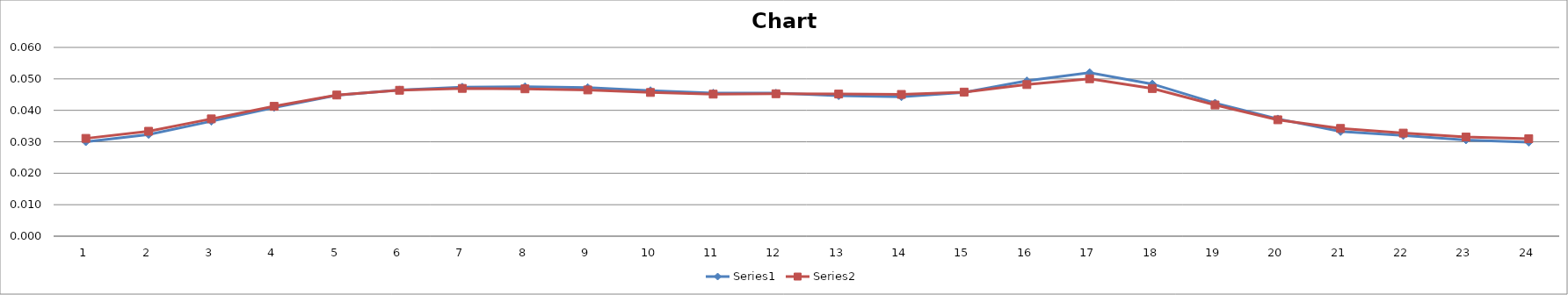
| Category | Series 0 | Series 1 |
|---|---|---|
| 0 | 0.03 | 0.031 |
| 1 | 0.032 | 0.033 |
| 2 | 0.037 | 0.037 |
| 3 | 0.041 | 0.041 |
| 4 | 0.045 | 0.045 |
| 5 | 0.046 | 0.046 |
| 6 | 0.047 | 0.047 |
| 7 | 0.048 | 0.047 |
| 8 | 0.047 | 0.046 |
| 9 | 0.046 | 0.046 |
| 10 | 0.045 | 0.045 |
| 11 | 0.045 | 0.045 |
| 12 | 0.045 | 0.045 |
| 13 | 0.044 | 0.045 |
| 14 | 0.046 | 0.046 |
| 15 | 0.049 | 0.048 |
| 16 | 0.052 | 0.05 |
| 17 | 0.048 | 0.047 |
| 18 | 0.042 | 0.042 |
| 19 | 0.037 | 0.037 |
| 20 | 0.033 | 0.034 |
| 21 | 0.032 | 0.033 |
| 22 | 0.031 | 0.032 |
| 23 | 0.03 | 0.031 |